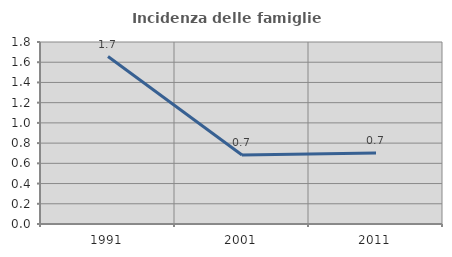
| Category | Incidenza delle famiglie numerose |
|---|---|
| 1991.0 | 1.656 |
| 2001.0 | 0.682 |
| 2011.0 | 0.703 |